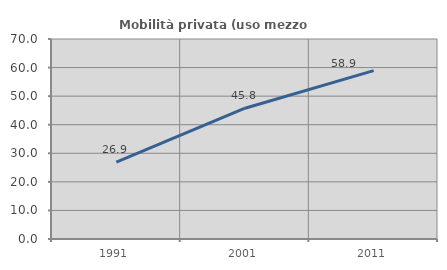
| Category | Mobilità privata (uso mezzo privato) |
|---|---|
| 1991.0 | 26.873 |
| 2001.0 | 45.774 |
| 2011.0 | 58.917 |